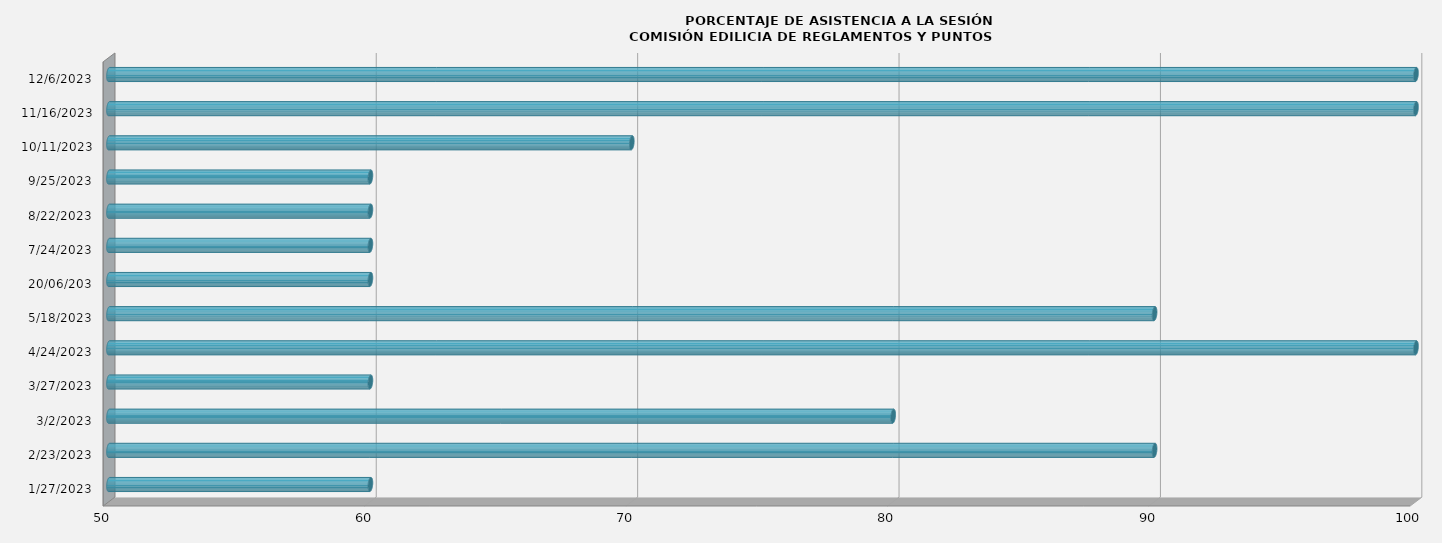
| Category | Series 0 |
|---|---|
| 27/01/2023 | 60 |
| 23/02/2023 | 90 |
| 02/03/2023 | 80 |
| 27/03/2023 | 60 |
| 24/04/2023 | 100 |
| 18/05/2023 | 90 |
| 20/06/203 | 60 |
| 24/07/2023 | 60 |
| 22/08/2023 | 60 |
| 25/09/2023 | 60 |
| 11/10/2023 | 70 |
| 16/11/2023 | 100 |
| 06/12/2023 | 100 |